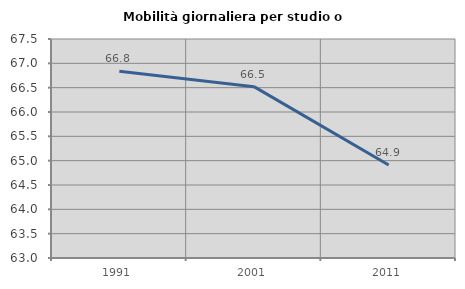
| Category | Mobilità giornaliera per studio o lavoro |
|---|---|
| 1991.0 | 66.839 |
| 2001.0 | 66.521 |
| 2011.0 | 64.912 |